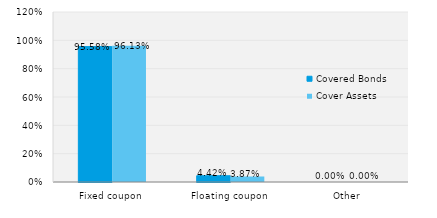
| Category | Covered Bonds | Cover Assets |
|---|---|---|
| Fixed coupon | 0.956 | 0.961 |
| Floating coupon | 0.044 | 0.039 |
| Other | 0 | 0 |